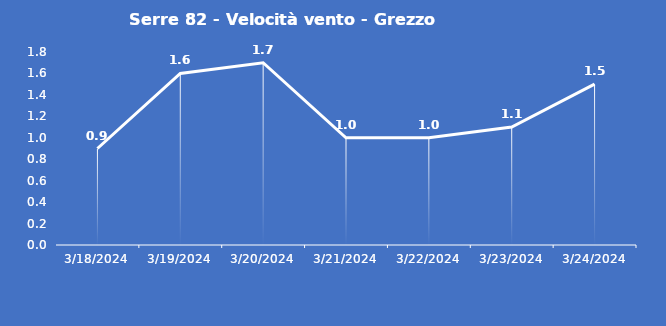
| Category | Serre 82 - Velocità vento - Grezzo (m/s) |
|---|---|
| 3/18/24 | 0.9 |
| 3/19/24 | 1.6 |
| 3/20/24 | 1.7 |
| 3/21/24 | 1 |
| 3/22/24 | 1 |
| 3/23/24 | 1.1 |
| 3/24/24 | 1.5 |